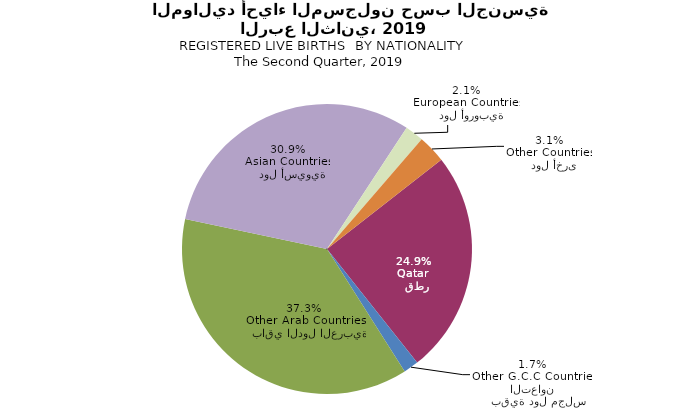
| Category | Series 0 |
|---|---|
|   قطر
Qatar | 1668 |
|   بقية دول مجلس التعاون
Other G.C.C Countries | 112 |
|   باقي الدول العربية
Other Arab Countries | 2501 |
|   دول أسيوية
Asian Countries | 2074 |
|   دول أوروبية
European Countries | 139 |
|   دول أخرى
Other Countries | 209 |